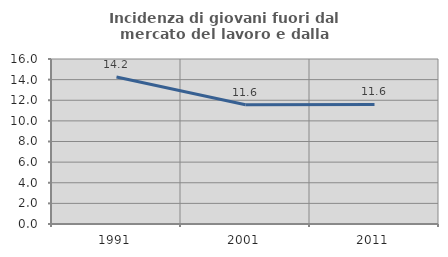
| Category | Incidenza di giovani fuori dal mercato del lavoro e dalla formazione  |
|---|---|
| 1991.0 | 14.249 |
| 2001.0 | 11.562 |
| 2011.0 | 11.599 |